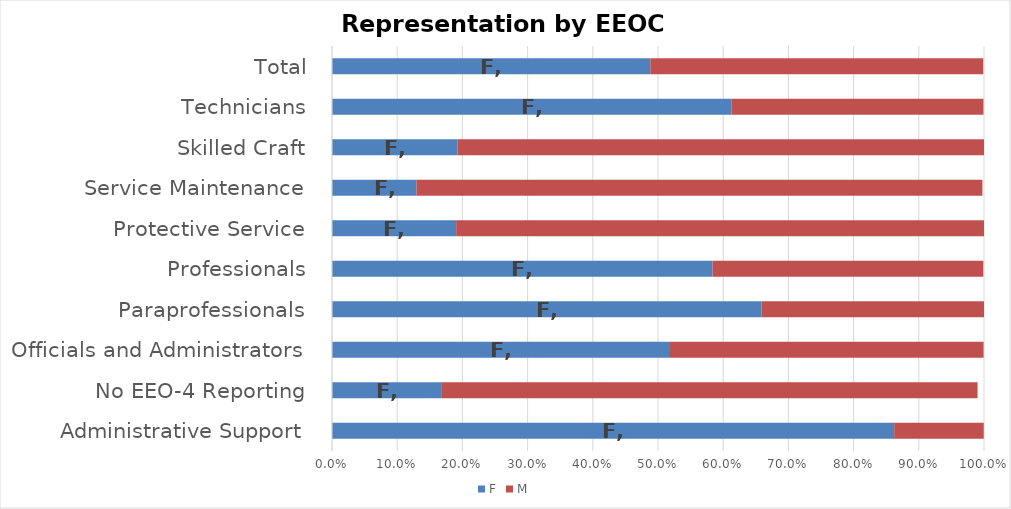
| Category | F | M |
|---|---|---|
| Administrative Support | 0.862 | 0.137 |
| No EEO-4 Reporting | 0.169 | 0.822 |
| Officials and Administrators | 0.517 | 0.482 |
| Paraprofessionals | 0.659 | 0.341 |
| Professionals | 0.584 | 0.415 |
| Protective Service | 0.19 | 0.81 |
| Service Maintenance | 0.129 | 0.868 |
| Skilled Craft | 0.193 | 0.807 |
| Technicians | 0.613 | 0.387 |
| Total | 0.488 | 0.511 |